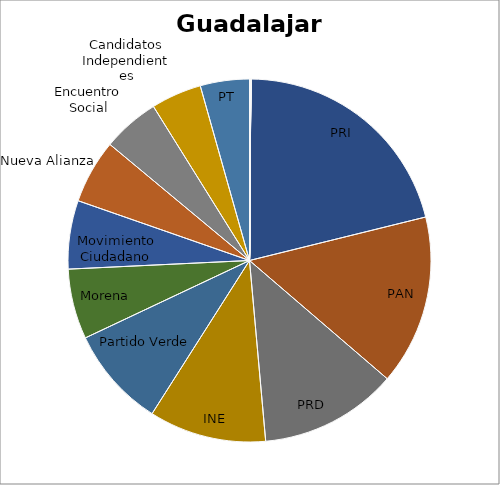
| Category | audiencia |
|---|---|
| PRI | 22606683 |
| PAN | 16188414 |
| PRD | 13134987 |
| INE | 11162582 |
| Partido Verde | 9587207 |
| Morena | 6686150 |
| Movimiento Ciudadano | 6518934 |
| Nueva Alianza | 6094954 |
| Encuentro Social | 5433427 |
| Candidatos Independientes | 4815016 |
| PT | 4674827 |